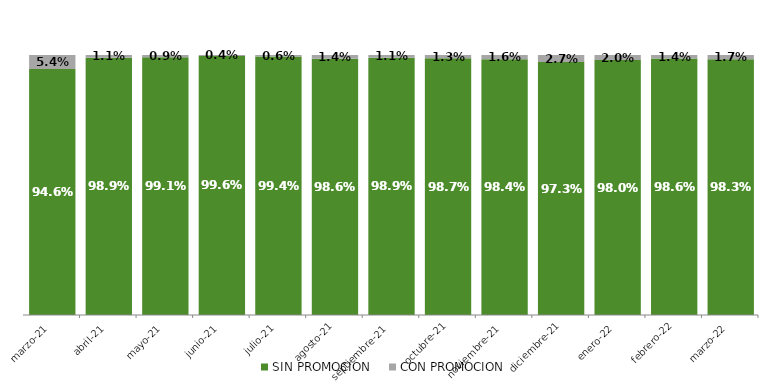
| Category | SIN PROMOCION   | CON PROMOCION   |
|---|---|---|
| 2021-03-01 | 0.946 | 0.054 |
| 2021-04-01 | 0.989 | 0.011 |
| 2021-05-01 | 0.991 | 0.009 |
| 2021-06-01 | 0.996 | 0.004 |
| 2021-07-01 | 0.994 | 0.006 |
| 2021-08-01 | 0.986 | 0.014 |
| 2021-09-01 | 0.989 | 0.011 |
| 2021-10-01 | 0.987 | 0.013 |
| 2021-11-01 | 0.984 | 0.016 |
| 2021-12-01 | 0.973 | 0.027 |
| 2022-01-01 | 0.98 | 0.02 |
| 2022-02-01 | 0.986 | 0.014 |
| 2022-03-01 | 0.983 | 0.017 |